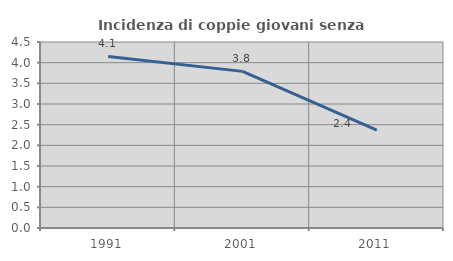
| Category | Incidenza di coppie giovani senza figli |
|---|---|
| 1991.0 | 4.149 |
| 2001.0 | 3.789 |
| 2011.0 | 2.366 |